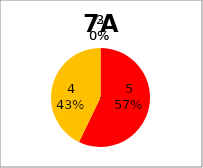
| Category | Series 0 |
|---|---|
| 5.0 | 4 |
| 4.0 | 3 |
| 3.0 | 0 |
| 2.0 | 0 |